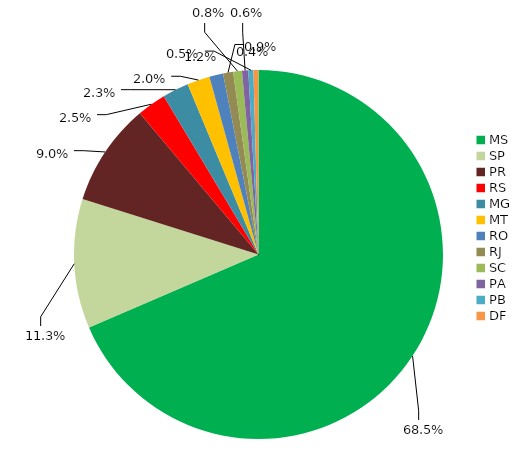
| Category | Series 0 |
|---|---|
| MS | 0.671 |
| SP | 0.111 |
| PR | 0.088 |
| RS | 0.025 |
| MG | 0.023 |
| MT | 0.019 |
| RO | 0.012 |
| RJ | 0.009 |
| SC | 0.008 |
| PA | 0.005 |
| PB | 0.004 |
| DF | 0.004 |